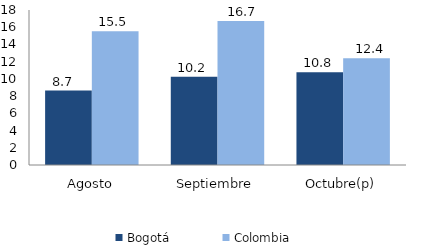
| Category | Bogotá | Colombia |
|---|---|---|
| Agosto | 8.651 | 15.533 |
| Septiembre | 10.241 | 16.736 |
| Octubre(p) | 10.78 | 12.405 |